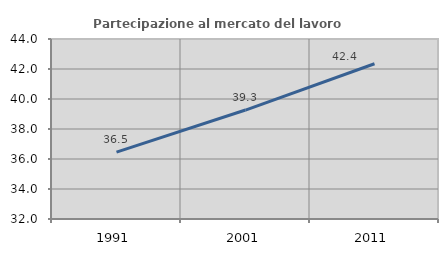
| Category | Partecipazione al mercato del lavoro  femminile |
|---|---|
| 1991.0 | 36.462 |
| 2001.0 | 39.264 |
| 2011.0 | 42.352 |